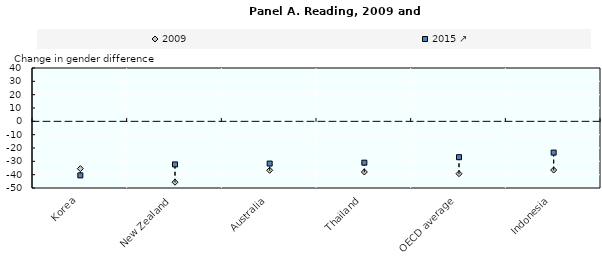
| Category | 2009 | 2015 ↗ |
|---|---|---|
| Korea | -35.479 | -40.54 |
| New Zealand | -45.651 | -32.294 |
| Australia | -36.71 | -31.68 |
| Thailand | -38 | -31 |
| OECD average | -39.298 | -26.895 |
| Indonesia | -36.53 | -23.435 |